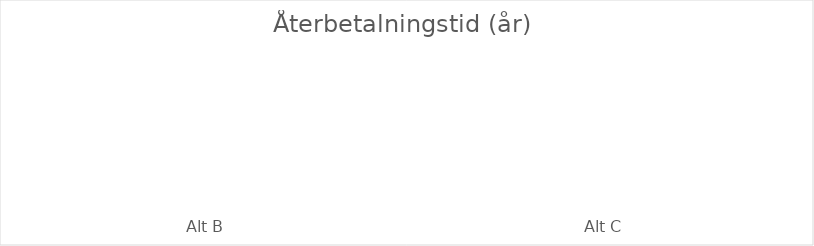
| Category | Återbetalningstid |
|---|---|
| Alt B | 0 |
| Alt C | 0 |